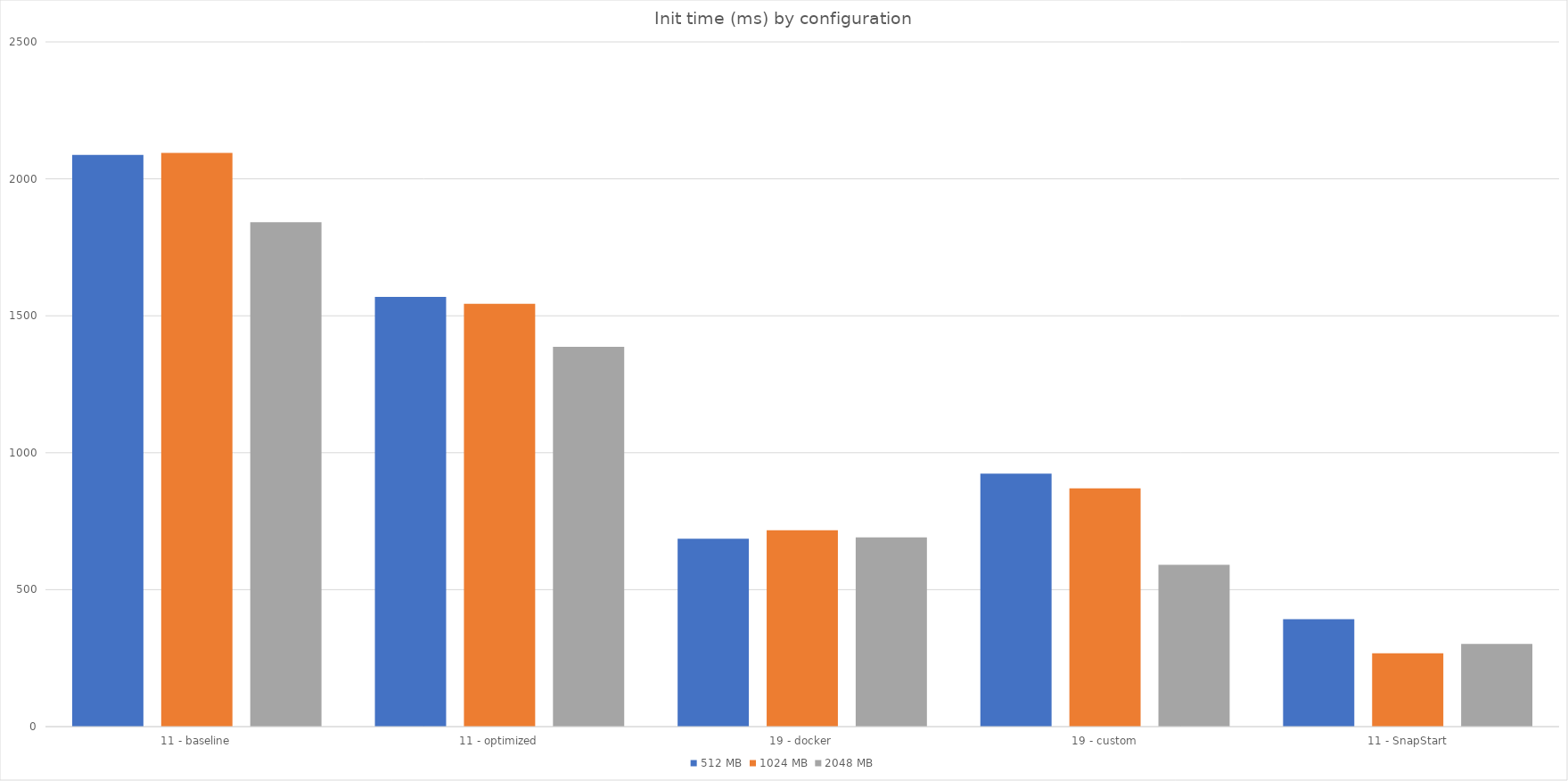
| Category | 512 MB | 1024 MB | 2048 MB |
|---|---|---|---|
| 11 - baseline | 2087 | 2095 | 1842 |
| 11 - optimized | 1569 | 1544 | 1387 |
| 19 - docker | 686 | 717 | 691 |
| 19 - custom | 924 | 870 | 591 |
| 11 - SnapStart | 392 | 268 | 302 |